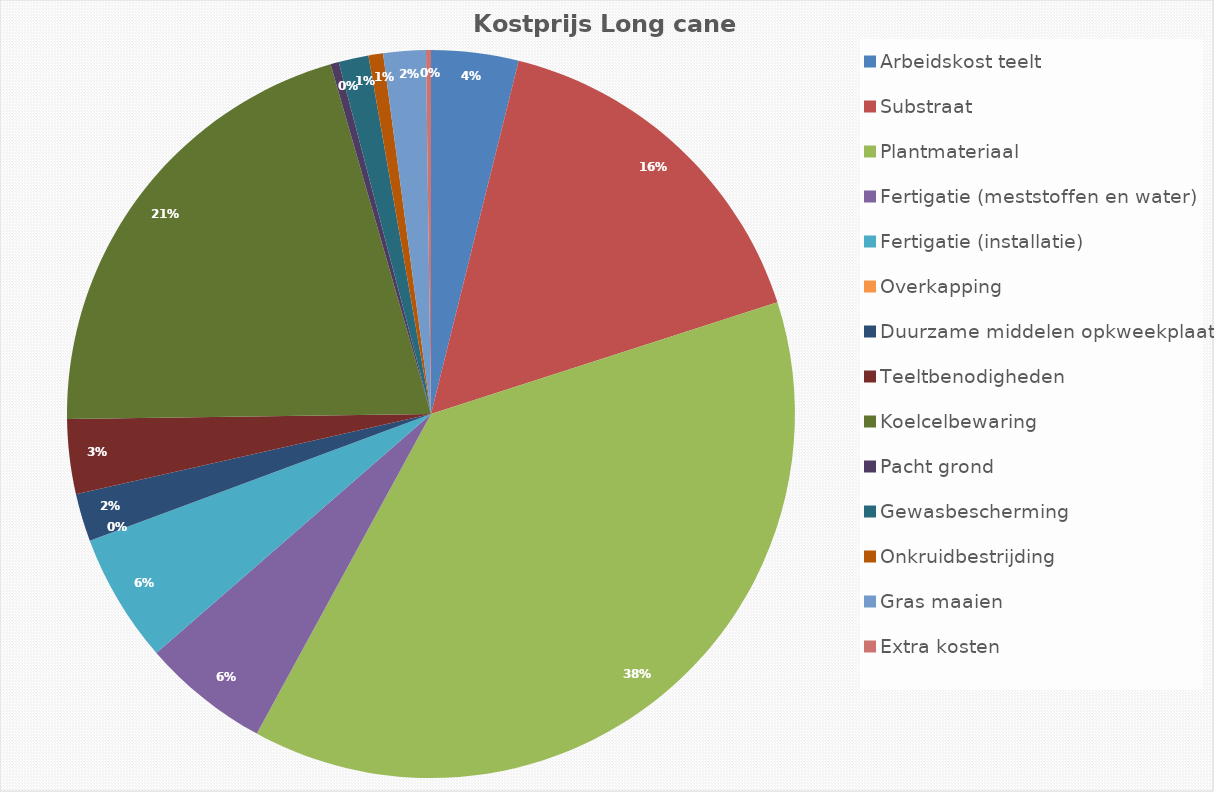
| Category | Series 0 |
|---|---|
| Arbeidskost teelt | 0.194 |
| Substraat | 0.81 |
| Plantmateriaal | 1.9 |
| Fertigatie (meststoffen en water) | 0.284 |
| Fertigatie (installatie) | 0.287 |
| Overkapping | 0 |
| Duurzame middelen opkweekplaats | 0.107 |
| Teeltbenodigheden | 0.167 |
| Koelcelbewaring | 1.041 |
| Pacht grond | 0.018 |
| Gewasbescherming | 0.067 |
| Onkruidbestrijding | 0.032 |
| Gras maaien | 0.094 |
| Extra kosten | 0.011 |